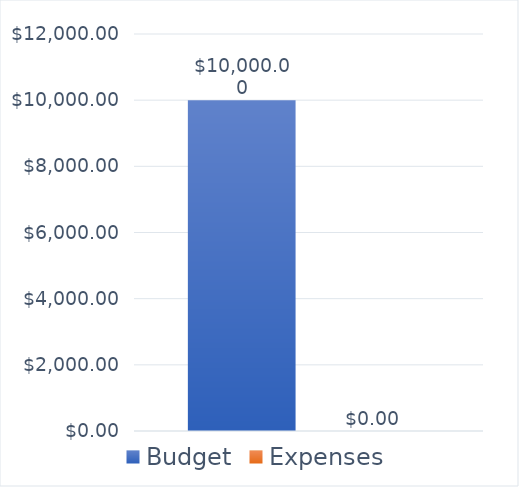
| Category | Budget | Expenses |
|---|---|---|
| 0 | 10000 | 0 |